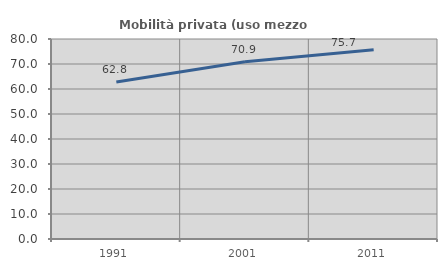
| Category | Mobilità privata (uso mezzo privato) |
|---|---|
| 1991.0 | 62.769 |
| 2001.0 | 70.873 |
| 2011.0 | 75.739 |